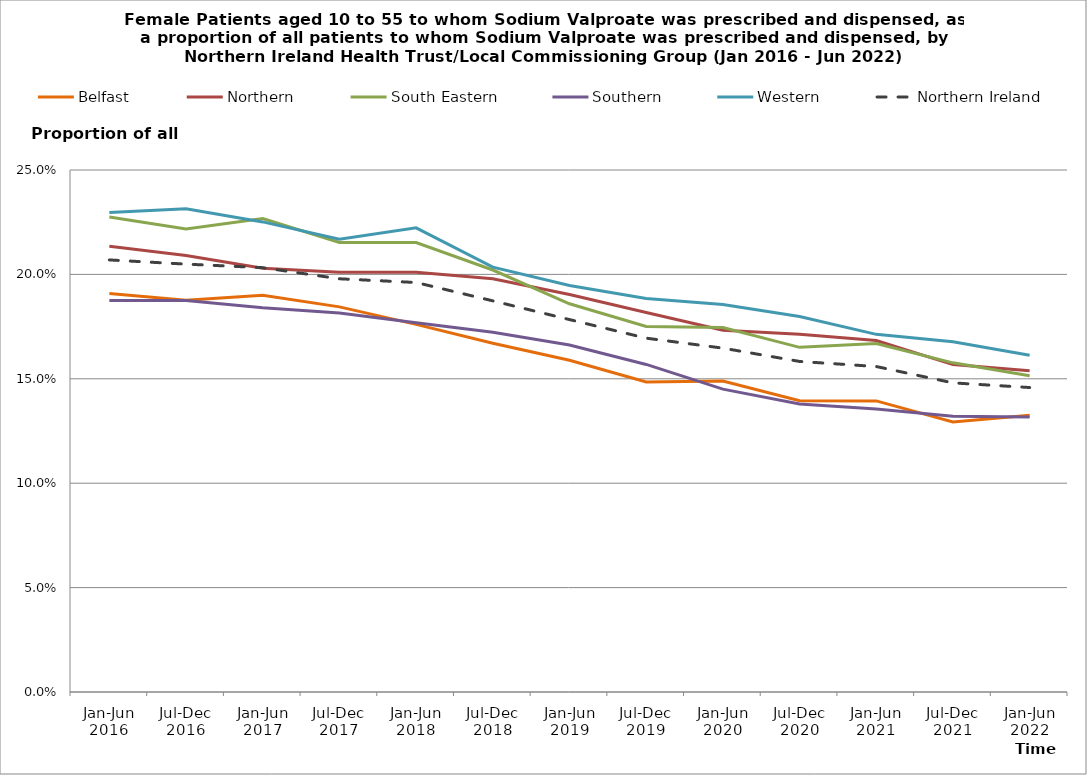
| Category | Belfast | Northern | South Eastern | Southern | Western | Northern Ireland |
|---|---|---|---|---|---|---|
| Jan-Jun 2016 | 0.191 | 0.213 | 0.228 | 0.188 | 0.23 | 0.207 |
| Jul-Dec 2016 | 0.188 | 0.209 | 0.222 | 0.188 | 0.231 | 0.205 |
| Jan-Jun 2017 | 0.19 | 0.203 | 0.227 | 0.184 | 0.225 | 0.203 |
| Jul-Dec 2017 | 0.184 | 0.201 | 0.215 | 0.182 | 0.217 | 0.198 |
| Jan-Jun 2018 | 0.176 | 0.201 | 0.215 | 0.177 | 0.222 | 0.196 |
| Jul-Dec 2018 | 0.167 | 0.198 | 0.202 | 0.172 | 0.203 | 0.187 |
| Jan-Jun 2019 | 0.159 | 0.19 | 0.186 | 0.166 | 0.195 | 0.178 |
| Jul-Dec 2019 | 0.148 | 0.182 | 0.175 | 0.157 | 0.188 | 0.169 |
| Jan-Jun 2020 | 0.149 | 0.173 | 0.175 | 0.145 | 0.186 | 0.165 |
| Jul-Dec 2020 | 0.139 | 0.171 | 0.165 | 0.138 | 0.18 | 0.158 |
| Jan-Jun 2021 | 0.139 | 0.168 | 0.167 | 0.136 | 0.171 | 0.156 |
| Jul-Dec 2021 | 0.129 | 0.157 | 0.158 | 0.132 | 0.168 | 0.148 |
| Jan-Jun 2022 | 0.133 | 0.154 | 0.151 | 0.132 | 0.161 | 0.146 |